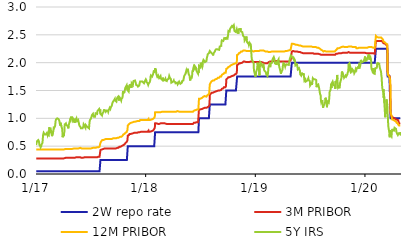
| Category | 2W repo rate | 3M PRIBOR | 12M PRIBOR | 5Y IRS |
|---|---|---|---|---|
| 2017-01-02 | 0.05 | 0.28 | 0.44 | 0.52 |
| 2017-01-03 | 0.05 | 0.28 | 0.44 | 0.52 |
| 2017-01-04 | 0.05 | 0.28 | 0.44 | 0.57 |
| 2017-01-05 | 0.05 | 0.28 | 0.44 | 0.59 |
| 2017-01-06 | 0.05 | 0.28 | 0.44 | 0.58 |
| 2017-01-09 | 0.05 | 0.28 | 0.44 | 0.61 |
| 2017-01-10 | 0.05 | 0.28 | 0.44 | 0.6 |
| 2017-01-11 | 0.05 | 0.28 | 0.44 | 0.59 |
| 2017-01-12 | 0.05 | 0.28 | 0.44 | 0.56 |
| 2017-01-13 | 0.05 | 0.28 | 0.44 | 0.52 |
| 2017-01-16 | 0.05 | 0.28 | 0.44 | 0.5 |
| 2017-01-17 | 0.05 | 0.28 | 0.44 | 0.48 |
| 2017-01-18 | 0.05 | 0.28 | 0.44 | 0.48 |
| 2017-01-19 | 0.05 | 0.28 | 0.44 | 0.5 |
| 2017-01-20 | 0.05 | 0.28 | 0.44 | 0.53 |
| 2017-01-23 | 0.05 | 0.28 | 0.44 | 0.56 |
| 2017-01-24 | 0.05 | 0.28 | 0.44 | 0.62 |
| 2017-01-25 | 0.05 | 0.28 | 0.44 | 0.7 |
| 2017-01-26 | 0.05 | 0.28 | 0.44 | 0.7 |
| 2017-01-27 | 0.05 | 0.28 | 0.44 | 0.74 |
| 2017-01-30 | 0.05 | 0.28 | 0.44 | 0.71 |
| 2017-01-31 | 0.05 | 0.28 | 0.44 | 0.71 |
| 2017-02-01 | 0.05 | 0.28 | 0.44 | 0.7 |
| 2017-02-02 | 0.05 | 0.28 | 0.44 | 0.72 |
| 2017-02-03 | 0.05 | 0.28 | 0.44 | 0.71 |
| 2017-02-06 | 0.05 | 0.28 | 0.44 | 0.71 |
| 2017-02-07 | 0.05 | 0.28 | 0.44 | 0.74 |
| 2017-02-08 | 0.05 | 0.28 | 0.44 | 0.75 |
| 2017-02-09 | 0.05 | 0.28 | 0.44 | 0.7 |
| 2017-02-10 | 0.05 | 0.28 | 0.44 | 0.72 |
| 2017-02-13 | 0.05 | 0.28 | 0.44 | 0.7 |
| 2017-02-14 | 0.05 | 0.28 | 0.44 | 0.77 |
| 2017-02-15 | 0.05 | 0.28 | 0.44 | 0.84 |
| 2017-02-16 | 0.05 | 0.28 | 0.44 | 0.83 |
| 2017-02-17 | 0.05 | 0.28 | 0.44 | 0.76 |
| 2017-02-20 | 0.05 | 0.28 | 0.44 | 0.79 |
| 2017-02-21 | 0.05 | 0.28 | 0.44 | 0.8 |
| 2017-02-22 | 0.05 | 0.28 | 0.44 | 0.78 |
| 2017-02-23 | 0.05 | 0.28 | 0.44 | 0.7 |
| 2017-02-24 | 0.05 | 0.28 | 0.44 | 0.68 |
| 2017-02-27 | 0.05 | 0.28 | 0.44 | 0.68 |
| 2017-02-28 | 0.05 | 0.28 | 0.44 | 0.77 |
| 2017-03-01 | 0.05 | 0.28 | 0.44 | 0.77 |
| 2017-03-02 | 0.05 | 0.28 | 0.44 | 0.85 |
| 2017-03-03 | 0.05 | 0.28 | 0.44 | 0.83 |
| 2017-03-06 | 0.05 | 0.28 | 0.44 | 0.86 |
| 2017-03-07 | 0.05 | 0.28 | 0.44 | 0.87 |
| 2017-03-08 | 0.05 | 0.28 | 0.44 | 0.96 |
| 2017-03-09 | 0.05 | 0.28 | 0.44 | 0.98 |
| 2017-03-10 | 0.05 | 0.28 | 0.44 | 0.99 |
| 2017-03-13 | 0.05 | 0.28 | 0.44 | 1 |
| 2017-03-14 | 0.05 | 0.28 | 0.44 | 1 |
| 2017-03-15 | 0.05 | 0.28 | 0.44 | 0.99 |
| 2017-03-16 | 0.05 | 0.28 | 0.44 | 0.99 |
| 2017-03-17 | 0.05 | 0.28 | 0.44 | 0.99 |
| 2017-03-20 | 0.05 | 0.28 | 0.44 | 0.96 |
| 2017-03-21 | 0.05 | 0.28 | 0.44 | 0.97 |
| 2017-03-22 | 0.05 | 0.28 | 0.44 | 0.9 |
| 2017-03-23 | 0.05 | 0.28 | 0.44 | 0.87 |
| 2017-03-24 | 0.05 | 0.28 | 0.44 | 0.92 |
| 2017-03-27 | 0.05 | 0.28 | 0.44 | 0.86 |
| 2017-03-28 | 0.05 | 0.28 | 0.44 | 0.84 |
| 2017-03-29 | 0.05 | 0.28 | 0.44 | 0.84 |
| 2017-03-30 | 0.05 | 0.28 | 0.44 | 0.8 |
| 2017-03-31 | 0.05 | 0.28 | 0.44 | 0.66 |
| 2017-04-03 | 0.05 | 0.28 | 0.44 | 0.71 |
| 2017-04-04 | 0.05 | 0.28 | 0.44 | 0.68 |
| 2017-04-05 | 0.05 | 0.28 | 0.44 | 0.73 |
| 2017-04-06 | 0.05 | 0.28 | 0.44 | 0.76 |
| 2017-04-07 | 0.05 | 0.29 | 0.44 | 0.89 |
| 2017-04-10 | 0.05 | 0.29 | 0.45 | 0.89 |
| 2017-04-11 | 0.05 | 0.29 | 0.45 | 0.91 |
| 2017-04-12 | 0.05 | 0.29 | 0.45 | 0.89 |
| 2017-04-13 | 0.05 | 0.29 | 0.45 | 0.88 |
| 2017-04-18 | 0.05 | 0.29 | 0.45 | 0.85 |
| 2017-04-19 | 0.05 | 0.29 | 0.45 | 0.82 |
| 2017-04-20 | 0.05 | 0.29 | 0.45 | 0.87 |
| 2017-04-21 | 0.05 | 0.29 | 0.45 | 0.88 |
| 2017-04-24 | 0.05 | 0.29 | 0.45 | 0.95 |
| 2017-04-25 | 0.05 | 0.29 | 0.45 | 0.93 |
| 2017-04-26 | 0.05 | 0.29 | 0.45 | 0.94 |
| 2017-04-27 | 0.05 | 0.29 | 0.45 | 0.99 |
| 2017-04-28 | 0.05 | 0.29 | 0.45 | 1.02 |
| 2017-05-02 | 0.05 | 0.29 | 0.45 | 1.02 |
| 2017-05-03 | 0.05 | 0.29 | 0.45 | 0.98 |
| 2017-05-04 | 0.05 | 0.29 | 0.45 | 1.01 |
| 2017-05-05 | 0.05 | 0.29 | 0.45 | 0.95 |
| 2017-05-09 | 0.05 | 0.29 | 0.46 | 0.97 |
| 2017-05-10 | 0.05 | 0.29 | 0.46 | 0.92 |
| 2017-05-11 | 0.05 | 0.3 | 0.46 | 0.94 |
| 2017-05-12 | 0.05 | 0.3 | 0.46 | 0.96 |
| 2017-05-15 | 0.05 | 0.3 | 0.46 | 0.96 |
| 2017-05-16 | 0.05 | 0.3 | 0.46 | 1 |
| 2017-05-17 | 0.05 | 0.3 | 0.46 | 0.97 |
| 2017-05-18 | 0.05 | 0.3 | 0.46 | 0.95 |
| 2017-05-19 | 0.05 | 0.3 | 0.46 | 0.96 |
| 2017-05-22 | 0.05 | 0.3 | 0.46 | 0.97 |
| 2017-05-23 | 0.05 | 0.3 | 0.46 | 0.94 |
| 2017-05-24 | 0.05 | 0.3 | 0.47 | 0.92 |
| 2017-05-25 | 0.05 | 0.3 | 0.47 | 0.89 |
| 2017-05-26 | 0.05 | 0.3 | 0.47 | 0.87 |
| 2017-05-29 | 0.05 | 0.3 | 0.47 | 0.87 |
| 2017-05-30 | 0.05 | 0.3 | 0.46 | 0.84 |
| 2017-05-31 | 0.05 | 0.3 | 0.46 | 0.82 |
| 2017-06-01 | 0.05 | 0.3 | 0.46 | 0.81 |
| 2017-06-02 | 0.05 | 0.29 | 0.46 | 0.81 |
| 2017-06-05 | 0.05 | 0.29 | 0.46 | 0.82 |
| 2017-06-06 | 0.05 | 0.29 | 0.46 | 0.82 |
| 2017-06-07 | 0.05 | 0.29 | 0.46 | 0.81 |
| 2017-06-08 | 0.05 | 0.29 | 0.46 | 0.85 |
| 2017-06-09 | 0.05 | 0.3 | 0.46 | 0.89 |
| 2017-06-12 | 0.05 | 0.3 | 0.46 | 0.86 |
| 2017-06-13 | 0.05 | 0.3 | 0.46 | 0.87 |
| 2017-06-14 | 0.05 | 0.3 | 0.46 | 0.87 |
| 2017-06-15 | 0.05 | 0.3 | 0.46 | 0.83 |
| 2017-06-16 | 0.05 | 0.3 | 0.46 | 0.88 |
| 2017-06-19 | 0.05 | 0.3 | 0.46 | 0.86 |
| 2017-06-20 | 0.05 | 0.3 | 0.46 | 0.86 |
| 2017-06-21 | 0.05 | 0.3 | 0.46 | 0.86 |
| 2017-06-22 | 0.05 | 0.3 | 0.46 | 0.86 |
| 2017-06-23 | 0.05 | 0.3 | 0.46 | 0.84 |
| 2017-06-26 | 0.05 | 0.3 | 0.46 | 0.83 |
| 2017-06-27 | 0.05 | 0.3 | 0.46 | 0.82 |
| 2017-06-28 | 0.05 | 0.3 | 0.46 | 0.89 |
| 2017-06-29 | 0.05 | 0.29 | 0.46 | 0.94 |
| 2017-06-30 | 0.05 | 0.3 | 0.46 | 0.97 |
| 2017-07-03 | 0.05 | 0.3 | 0.46 | 0.99 |
| 2017-07-04 | 0.05 | 0.3 | 0.46 | 0.98 |
| 2017-07-07 | 0.05 | 0.3 | 0.47 | 1.06 |
| 2017-07-10 | 0.05 | 0.3 | 0.47 | 1.08 |
| 2017-07-11 | 0.05 | 0.3 | 0.47 | 1.05 |
| 2017-07-12 | 0.05 | 0.3 | 0.47 | 1.05 |
| 2017-07-13 | 0.05 | 0.3 | 0.47 | 1.03 |
| 2017-07-14 | 0.05 | 0.3 | 0.47 | 1.03 |
| 2017-07-17 | 0.05 | 0.3 | 0.47 | 1.03 |
| 2017-07-18 | 0.05 | 0.3 | 0.47 | 1.03 |
| 2017-07-19 | 0.05 | 0.3 | 0.47 | 1.09 |
| 2017-07-20 | 0.05 | 0.3 | 0.48 | 1.1 |
| 2017-07-21 | 0.05 | 0.3 | 0.48 | 1.08 |
| 2017-07-24 | 0.05 | 0.3 | 0.48 | 1.08 |
| 2017-07-25 | 0.05 | 0.3 | 0.48 | 1.13 |
| 2017-07-26 | 0.05 | 0.3 | 0.48 | 1.14 |
| 2017-07-27 | 0.05 | 0.3 | 0.48 | 1.14 |
| 2017-07-28 | 0.05 | 0.31 | 0.48 | 1.15 |
| 2017-07-31 | 0.05 | 0.31 | 0.49 | 1.17 |
| 2017-08-01 | 0.05 | 0.31 | 0.49 | 1.18 |
| 2017-08-02 | 0.05 | 0.31 | 0.49 | 1.14 |
| 2017-08-03 | 0.05 | 0.31 | 0.49 | 1.16 |
| 2017-08-04 | 0.25 | 0.43 | 0.56 | 1.08 |
| 2017-08-07 | 0.25 | 0.44 | 0.59 | 1.07 |
| 2017-08-08 | 0.25 | 0.44 | 0.6 | 1.06 |
| 2017-08-09 | 0.25 | 0.45 | 0.6 | 1.09 |
| 2017-08-10 | 0.25 | 0.45 | 0.61 | 1.07 |
| 2017-08-11 | 0.25 | 0.45 | 0.61 | 1.09 |
| 2017-08-14 | 0.25 | 0.45 | 0.61 | 1.11 |
| 2017-08-15 | 0.25 | 0.45 | 0.61 | 1.11 |
| 2017-08-16 | 0.25 | 0.45 | 0.62 | 1.16 |
| 2017-08-17 | 0.25 | 0.46 | 0.62 | 1.14 |
| 2017-08-18 | 0.25 | 0.46 | 0.62 | 1.14 |
| 2017-08-21 | 0.25 | 0.46 | 0.62 | 1.14 |
| 2017-08-22 | 0.25 | 0.46 | 0.63 | 1.12 |
| 2017-08-23 | 0.25 | 0.46 | 0.63 | 1.13 |
| 2017-08-24 | 0.25 | 0.46 | 0.63 | 1.13 |
| 2017-08-25 | 0.25 | 0.46 | 0.63 | 1.14 |
| 2017-08-28 | 0.25 | 0.46 | 0.63 | 1.14 |
| 2017-08-29 | 0.25 | 0.46 | 0.63 | 1.14 |
| 2017-08-30 | 0.25 | 0.46 | 0.63 | 1.12 |
| 2017-08-31 | 0.25 | 0.46 | 0.63 | 1.14 |
| 2017-09-01 | 0.25 | 0.46 | 0.63 | 1.15 |
| 2017-09-04 | 0.25 | 0.46 | 0.63 | 1.19 |
| 2017-09-05 | 0.25 | 0.46 | 0.63 | 1.19 |
| 2017-09-06 | 0.25 | 0.46 | 0.63 | 1.17 |
| 2017-09-07 | 0.25 | 0.46 | 0.63 | 1.19 |
| 2017-09-08 | 0.25 | 0.46 | 0.63 | 1.2 |
| 2017-09-11 | 0.25 | 0.46 | 0.63 | 1.23 |
| 2017-09-12 | 0.25 | 0.46 | 0.64 | 1.24 |
| 2017-09-13 | 0.25 | 0.46 | 0.64 | 1.28 |
| 2017-09-14 | 0.25 | 0.46 | 0.64 | 1.28 |
| 2017-09-15 | 0.25 | 0.46 | 0.64 | 1.3 |
| 2017-09-18 | 0.25 | 0.46 | 0.64 | 1.3 |
| 2017-09-19 | 0.25 | 0.46 | 0.64 | 1.33 |
| 2017-09-20 | 0.25 | 0.46 | 0.64 | 1.32 |
| 2017-09-21 | 0.25 | 0.46 | 0.64 | 1.35 |
| 2017-09-22 | 0.25 | 0.46 | 0.64 | 1.32 |
| 2017-09-25 | 0.25 | 0.46 | 0.64 | 1.31 |
| 2017-09-26 | 0.25 | 0.46 | 0.64 | 1.3 |
| 2017-09-27 | 0.25 | 0.47 | 0.64 | 1.33 |
| 2017-09-29 | 0.25 | 0.47 | 0.65 | 1.37 |
| 2017-10-02 | 0.25 | 0.47 | 0.65 | 1.39 |
| 2017-10-03 | 0.25 | 0.47 | 0.65 | 1.39 |
| 2017-10-04 | 0.25 | 0.47 | 0.65 | 1.36 |
| 2017-10-05 | 0.25 | 0.48 | 0.66 | 1.32 |
| 2017-10-06 | 0.25 | 0.49 | 0.66 | 1.38 |
| 2017-10-09 | 0.25 | 0.49 | 0.67 | 1.36 |
| 2017-10-10 | 0.25 | 0.49 | 0.67 | 1.35 |
| 2017-10-11 | 0.25 | 0.49 | 0.66 | 1.37 |
| 2017-10-12 | 0.25 | 0.49 | 0.66 | 1.32 |
| 2017-10-13 | 0.25 | 0.5 | 0.67 | 1.35 |
| 2017-10-16 | 0.25 | 0.51 | 0.68 | 1.37 |
| 2017-10-17 | 0.25 | 0.51 | 0.69 | 1.4 |
| 2017-10-18 | 0.25 | 0.52 | 0.7 | 1.49 |
| 2017-10-19 | 0.25 | 0.52 | 0.71 | 1.45 |
| 2017-10-20 | 0.25 | 0.52 | 0.71 | 1.46 |
| 2017-10-23 | 0.25 | 0.53 | 0.72 | 1.47 |
| 2017-10-24 | 0.25 | 0.54 | 0.72 | 1.47 |
| 2017-10-25 | 0.25 | 0.54 | 0.73 | 1.53 |
| 2017-10-26 | 0.25 | 0.55 | 0.74 | 1.55 |
| 2017-10-27 | 0.25 | 0.56 | 0.74 | 1.56 |
| 2017-10-30 | 0.25 | 0.57 | 0.75 | 1.59 |
| 2017-10-31 | 0.25 | 0.58 | 0.77 | 1.52 |
| 2017-11-01 | 0.25 | 0.59 | 0.77 | 1.53 |
| 2017-11-02 | 0.25 | 0.61 | 0.79 | 1.59 |
| 2017-11-03 | 0.5 | 0.69 | 0.87 | 1.5 |
| 2017-11-06 | 0.5 | 0.7 | 0.89 | 1.48 |
| 2017-11-07 | 0.5 | 0.7 | 0.89 | 1.53 |
| 2017-11-08 | 0.5 | 0.71 | 0.89 | 1.52 |
| 2017-11-09 | 0.5 | 0.72 | 0.9 | 1.57 |
| 2017-11-10 | 0.5 | 0.72 | 0.91 | 1.61 |
| 2017-11-13 | 0.5 | 0.72 | 0.91 | 1.56 |
| 2017-11-14 | 0.5 | 0.72 | 0.92 | 1.59 |
| 2017-11-15 | 0.5 | 0.72 | 0.92 | 1.55 |
| 2017-11-16 | 0.5 | 0.72 | 0.93 | 1.63 |
| 2017-11-20 | 0.5 | 0.73 | 0.93 | 1.6 |
| 2017-11-21 | 0.5 | 0.73 | 0.94 | 1.65 |
| 2017-11-22 | 0.5 | 0.73 | 0.94 | 1.67 |
| 2017-11-23 | 0.5 | 0.73 | 0.94 | 1.68 |
| 2017-11-24 | 0.5 | 0.74 | 0.94 | 1.68 |
| 2017-11-27 | 0.5 | 0.74 | 0.94 | 1.68 |
| 2017-11-28 | 0.5 | 0.74 | 0.94 | 1.68 |
| 2017-11-29 | 0.5 | 0.74 | 0.95 | 1.65 |
| 2017-11-30 | 0.5 | 0.74 | 0.95 | 1.66 |
| 2017-12-01 | 0.5 | 0.74 | 0.94 | 1.6 |
| 2017-12-04 | 0.5 | 0.74 | 0.95 | 1.6 |
| 2017-12-05 | 0.5 | 0.74 | 0.95 | 1.59 |
| 2017-12-06 | 0.5 | 0.74 | 0.95 | 1.58 |
| 2017-12-07 | 0.5 | 0.74 | 0.95 | 1.57 |
| 2017-12-08 | 0.5 | 0.75 | 0.95 | 1.57 |
| 2017-12-11 | 0.5 | 0.75 | 0.95 | 1.59 |
| 2017-12-12 | 0.5 | 0.75 | 0.95 | 1.59 |
| 2017-12-13 | 0.5 | 0.75 | 0.96 | 1.64 |
| 2017-12-14 | 0.5 | 0.76 | 0.97 | 1.66 |
| 2017-12-15 | 0.5 | 0.76 | 0.97 | 1.66 |
| 2017-12-18 | 0.5 | 0.76 | 0.97 | 1.66 |
| 2017-12-19 | 0.5 | 0.76 | 0.97 | 1.65 |
| 2017-12-20 | 0.5 | 0.76 | 0.97 | 1.66 |
| 2017-12-21 | 0.5 | 0.76 | 0.97 | 1.66 |
| 2017-12-22 | 0.5 | 0.76 | 0.97 | 1.66 |
| 2017-12-27 | 0.5 | 0.76 | 0.97 | 1.63 |
| 2017-12-28 | 0.5 | 0.76 | 0.97 | 1.64 |
| 2017-12-29 | 0.5 | 0.76 | 0.97 | 1.64 |
| 2018-01-02 | 0.5 | 0.76 | 0.97 | 1.7 |
| 2018-01-03 | 0.5 | 0.76 | 0.97 | 1.69 |
| 2018-01-04 | 0.5 | 0.76 | 0.97 | 1.68 |
| 2018-01-05 | 0.5 | 0.76 | 0.97 | 1.65 |
| 2018-01-08 | 0.5 | 0.76 | 0.97 | 1.63 |
| 2018-01-09 | 0.5 | 0.76 | 0.97 | 1.63 |
| 2018-01-10 | 0.5 | 0.76 | 0.97 | 1.6 |
| 2018-01-11 | 0.5 | 0.78 | 0.99 | 1.59 |
| 2018-01-12 | 0.5 | 0.76 | 0.97 | 1.63 |
| 2018-01-15 | 0.5 | 0.76 | 0.97 | 1.65 |
| 2018-01-16 | 0.5 | 0.76 | 0.97 | 1.66 |
| 2018-01-17 | 0.5 | 0.77 | 0.98 | 1.69 |
| 2018-01-18 | 0.5 | 0.77 | 0.98 | 1.75 |
| 2018-01-19 | 0.5 | 0.77 | 0.98 | 1.77 |
| 2018-01-22 | 0.5 | 0.77 | 0.98 | 1.77 |
| 2018-01-23 | 0.5 | 0.77 | 0.98 | 1.75 |
| 2018-01-24 | 0.5 | 0.77 | 0.98 | 1.75 |
| 2018-01-25 | 0.5 | 0.78 | 0.99 | 1.75 |
| 2018-01-26 | 0.5 | 0.78 | 0.99 | 1.79 |
| 2018-01-29 | 0.5 | 0.79 | 1 | 1.86 |
| 2018-01-30 | 0.5 | 0.81 | 1.01 | 1.84 |
| 2018-01-31 | 0.5 | 0.81 | 1.02 | 1.82 |
| 2018-02-01 | 0.5 | 0.83 | 1.03 | 1.86 |
| 2018-02-02 | 0.75 | 0.91 | 1.11 | 1.9 |
| 2018-02-05 | 0.75 | 0.91 | 1.11 | 1.86 |
| 2018-02-06 | 0.75 | 0.91 | 1.11 | 1.8 |
| 2018-02-07 | 0.75 | 0.91 | 1.11 | 1.79 |
| 2018-02-08 | 0.75 | 0.91 | 1.11 | 1.81 |
| 2018-02-09 | 0.75 | 0.9 | 1.11 | 1.75 |
| 2018-02-12 | 0.75 | 0.9 | 1.11 | 1.77 |
| 2018-02-13 | 0.75 | 0.9 | 1.11 | 1.75 |
| 2018-02-14 | 0.75 | 0.9 | 1.11 | 1.72 |
| 2018-02-15 | 0.75 | 0.9 | 1.11 | 1.76 |
| 2018-02-16 | 0.75 | 0.9 | 1.11 | 1.73 |
| 2018-02-19 | 0.75 | 0.91 | 1.11 | 1.72 |
| 2018-02-20 | 0.75 | 0.91 | 1.11 | 1.76 |
| 2018-02-21 | 0.75 | 0.91 | 1.11 | 1.73 |
| 2018-02-22 | 0.75 | 0.91 | 1.12 | 1.71 |
| 2018-02-23 | 0.75 | 0.91 | 1.12 | 1.71 |
| 2018-02-26 | 0.75 | 0.91 | 1.12 | 1.69 |
| 2018-02-27 | 0.75 | 0.91 | 1.12 | 1.71 |
| 2018-02-28 | 0.75 | 0.91 | 1.12 | 1.73 |
| 2018-03-01 | 0.75 | 0.91 | 1.12 | 1.7 |
| 2018-03-02 | 0.75 | 0.91 | 1.12 | 1.68 |
| 2018-03-05 | 0.75 | 0.91 | 1.12 | 1.67 |
| 2018-03-06 | 0.75 | 0.91 | 1.12 | 1.69 |
| 2018-03-07 | 0.75 | 0.91 | 1.12 | 1.69 |
| 2018-03-08 | 0.75 | 0.91 | 1.12 | 1.71 |
| 2018-03-09 | 0.75 | 0.9 | 1.12 | 1.68 |
| 2018-03-12 | 0.75 | 0.9 | 1.12 | 1.67 |
| 2018-03-13 | 0.75 | 0.9 | 1.12 | 1.67 |
| 2018-03-14 | 0.75 | 0.9 | 1.12 | 1.67 |
| 2018-03-15 | 0.75 | 0.9 | 1.12 | 1.7 |
| 2018-03-16 | 0.75 | 0.9 | 1.12 | 1.7 |
| 2018-03-19 | 0.75 | 0.9 | 1.12 | 1.71 |
| 2018-03-20 | 0.75 | 0.9 | 1.12 | 1.72 |
| 2018-03-21 | 0.75 | 0.9 | 1.12 | 1.76 |
| 2018-03-22 | 0.75 | 0.9 | 1.12 | 1.75 |
| 2018-03-23 | 0.75 | 0.9 | 1.12 | 1.73 |
| 2018-03-26 | 0.75 | 0.9 | 1.12 | 1.71 |
| 2018-03-27 | 0.75 | 0.9 | 1.12 | 1.69 |
| 2018-03-28 | 0.75 | 0.9 | 1.12 | 1.64 |
| 2018-03-29 | 0.75 | 0.9 | 1.12 | 1.65 |
| 2018-04-03 | 0.75 | 0.9 | 1.12 | 1.66 |
| 2018-04-04 | 0.75 | 0.9 | 1.12 | 1.66 |
| 2018-04-05 | 0.75 | 0.9 | 1.12 | 1.68 |
| 2018-04-06 | 0.75 | 0.9 | 1.12 | 1.66 |
| 2018-04-09 | 0.75 | 0.9 | 1.12 | 1.65 |
| 2018-04-10 | 0.75 | 0.9 | 1.12 | 1.65 |
| 2018-04-11 | 0.75 | 0.9 | 1.12 | 1.63 |
| 2018-04-12 | 0.75 | 0.9 | 1.12 | 1.62 |
| 2018-04-13 | 0.75 | 0.9 | 1.12 | 1.64 |
| 2018-04-16 | 0.75 | 0.9 | 1.12 | 1.64 |
| 2018-04-17 | 0.75 | 0.9 | 1.13 | 1.63 |
| 2018-04-18 | 0.75 | 0.9 | 1.12 | 1.61 |
| 2018-04-19 | 0.75 | 0.9 | 1.12 | 1.62 |
| 2018-04-20 | 0.75 | 0.9 | 1.12 | 1.63 |
| 2018-04-23 | 0.75 | 0.9 | 1.12 | 1.66 |
| 2018-04-24 | 0.75 | 0.9 | 1.12 | 1.65 |
| 2018-04-25 | 0.75 | 0.9 | 1.12 | 1.66 |
| 2018-04-26 | 0.75 | 0.9 | 1.12 | 1.66 |
| 2018-04-27 | 0.75 | 0.9 | 1.12 | 1.62 |
| 2018-04-30 | 0.75 | 0.9 | 1.12 | 1.62 |
| 2018-05-02 | 0.75 | 0.9 | 1.12 | 1.64 |
| 2018-05-03 | 0.75 | 0.9 | 1.12 | 1.67 |
| 2018-05-04 | 0.75 | 0.9 | 1.12 | 1.68 |
| 2018-05-07 | 0.75 | 0.9 | 1.12 | 1.68 |
| 2018-05-09 | 0.75 | 0.9 | 1.12 | 1.74 |
| 2018-05-10 | 0.75 | 0.9 | 1.12 | 1.76 |
| 2018-05-11 | 0.75 | 0.9 | 1.12 | 1.76 |
| 2018-05-14 | 0.75 | 0.9 | 1.12 | 1.8 |
| 2018-05-15 | 0.75 | 0.9 | 1.12 | 1.82 |
| 2018-05-16 | 0.75 | 0.9 | 1.12 | 1.84 |
| 2018-05-17 | 0.75 | 0.9 | 1.12 | 1.86 |
| 2018-05-18 | 0.75 | 0.9 | 1.12 | 1.84 |
| 2018-05-21 | 0.75 | 0.9 | 1.12 | 1.87 |
| 2018-05-22 | 0.75 | 0.9 | 1.12 | 1.89 |
| 2018-05-23 | 0.75 | 0.9 | 1.12 | 1.85 |
| 2018-05-24 | 0.75 | 0.9 | 1.12 | 1.82 |
| 2018-05-25 | 0.75 | 0.9 | 1.12 | 1.79 |
| 2018-05-28 | 0.75 | 0.9 | 1.12 | 1.76 |
| 2018-05-29 | 0.75 | 0.9 | 1.12 | 1.7 |
| 2018-05-30 | 0.75 | 0.9 | 1.12 | 1.68 |
| 2018-05-31 | 0.75 | 0.9 | 1.12 | 1.73 |
| 2018-06-01 | 0.75 | 0.9 | 1.12 | 1.72 |
| 2018-06-04 | 0.75 | 0.9 | 1.12 | 1.73 |
| 2018-06-05 | 0.75 | 0.9 | 1.12 | 1.76 |
| 2018-06-06 | 0.75 | 0.9 | 1.12 | 1.83 |
| 2018-06-07 | 0.75 | 0.9 | 1.12 | 1.86 |
| 2018-06-08 | 0.75 | 0.9 | 1.12 | 1.84 |
| 2018-06-11 | 0.75 | 0.92 | 1.13 | 1.93 |
| 2018-06-12 | 0.75 | 0.92 | 1.14 | 1.93 |
| 2018-06-13 | 0.75 | 0.92 | 1.14 | 1.91 |
| 2018-06-14 | 0.75 | 0.93 | 1.14 | 1.94 |
| 2018-06-15 | 0.75 | 0.92 | 1.14 | 1.94 |
| 2018-06-18 | 0.75 | 0.93 | 1.15 | 1.91 |
| 2018-06-19 | 0.75 | 0.93 | 1.15 | 1.87 |
| 2018-06-20 | 0.75 | 0.93 | 1.15 | 1.85 |
| 2018-06-21 | 0.75 | 0.93 | 1.15 | 1.85 |
| 2018-06-22 | 0.75 | 0.93 | 1.16 | 1.85 |
| 2018-06-25 | 0.75 | 0.93 | 1.16 | 1.8 |
| 2018-06-26 | 0.75 | 0.93 | 1.16 | 1.84 |
| 2018-06-27 | 0.75 | 0.93 | 1.16 | 1.82 |
| 2018-06-28 | 1 | 1.16 | 1.35 | 1.94 |
| 2018-06-29 | 1 | 1.16 | 1.35 | 1.94 |
| 2018-07-02 | 1 | 1.16 | 1.35 | 1.92 |
| 2018-07-03 | 1 | 1.16 | 1.35 | 1.97 |
| 2018-07-04 | 1 | 1.17 | 1.36 | 2 |
| 2018-07-09 | 1 | 1.17 | 1.37 | 1.92 |
| 2018-07-10 | 1 | 1.17 | 1.37 | 1.94 |
| 2018-07-11 | 1 | 1.18 | 1.38 | 2.02 |
| 2018-07-12 | 1 | 1.18 | 1.38 | 2.02 |
| 2018-07-13 | 1 | 1.18 | 1.39 | 2.05 |
| 2018-07-16 | 1 | 1.18 | 1.39 | 2.03 |
| 2018-07-17 | 1 | 1.19 | 1.4 | 2.03 |
| 2018-07-18 | 1 | 1.18 | 1.39 | 2.01 |
| 2018-07-19 | 1 | 1.19 | 1.39 | 2.02 |
| 2018-07-20 | 1 | 1.18 | 1.39 | 2.01 |
| 2018-07-23 | 1 | 1.19 | 1.39 | 2.03 |
| 2018-07-24 | 1 | 1.19 | 1.4 | 2.08 |
| 2018-07-25 | 1 | 1.2 | 1.41 | 2.09 |
| 2018-07-26 | 1 | 1.2 | 1.41 | 2.12 |
| 2018-07-27 | 1 | 1.2 | 1.41 | 2.15 |
| 2018-07-30 | 1 | 1.21 | 1.43 | 2.15 |
| 2018-07-31 | 1 | 1.22 | 1.43 | 2.17 |
| 2018-08-01 | 1 | 1.23 | 1.45 | 2.18 |
| 2018-08-02 | 1 | 1.24 | 1.45 | 2.17 |
| 2018-08-03 | 1.25 | 1.42 | 1.61 | 2.21 |
| 2018-08-06 | 1.25 | 1.44 | 1.64 | 2.19 |
| 2018-08-07 | 1.25 | 1.45 | 1.65 | 2.19 |
| 2018-08-08 | 1.25 | 1.45 | 1.66 | 2.19 |
| 2018-08-09 | 1.25 | 1.46 | 1.67 | 2.17 |
| 2018-08-10 | 1.25 | 1.46 | 1.67 | 2.18 |
| 2018-08-13 | 1.25 | 1.46 | 1.68 | 2.15 |
| 2018-08-14 | 1.25 | 1.46 | 1.68 | 2.13 |
| 2018-08-15 | 1.25 | 1.46 | 1.68 | 2.16 |
| 2018-08-16 | 1.25 | 1.46 | 1.68 | 2.17 |
| 2018-08-17 | 1.25 | 1.47 | 1.68 | 2.18 |
| 2018-08-20 | 1.25 | 1.47 | 1.69 | 2.2 |
| 2018-08-21 | 1.25 | 1.48 | 1.7 | 2.22 |
| 2018-08-22 | 1.25 | 1.48 | 1.71 | 2.22 |
| 2018-08-23 | 1.25 | 1.48 | 1.71 | 2.23 |
| 2018-08-24 | 1.25 | 1.48 | 1.71 | 2.24 |
| 2018-08-27 | 1.25 | 1.49 | 1.71 | 2.24 |
| 2018-08-28 | 1.25 | 1.49 | 1.72 | 2.24 |
| 2018-08-29 | 1.25 | 1.49 | 1.72 | 2.24 |
| 2018-08-30 | 1.25 | 1.49 | 1.73 | 2.24 |
| 2018-08-31 | 1.25 | 1.5 | 1.73 | 2.23 |
| 2018-09-03 | 1.25 | 1.5 | 1.73 | 2.23 |
| 2018-09-04 | 1.25 | 1.5 | 1.74 | 2.25 |
| 2018-09-05 | 1.25 | 1.51 | 1.74 | 2.29 |
| 2018-09-06 | 1.25 | 1.51 | 1.75 | 2.3 |
| 2018-09-07 | 1.25 | 1.51 | 1.74 | 2.3 |
| 2018-09-10 | 1.25 | 1.51 | 1.75 | 2.3 |
| 2018-09-11 | 1.25 | 1.52 | 1.77 | 2.37 |
| 2018-09-12 | 1.25 | 1.53 | 1.78 | 2.4 |
| 2018-09-13 | 1.25 | 1.54 | 1.78 | 2.39 |
| 2018-09-14 | 1.25 | 1.54 | 1.79 | 2.39 |
| 2018-09-17 | 1.25 | 1.54 | 1.79 | 2.39 |
| 2018-09-18 | 1.25 | 1.55 | 1.8 | 2.39 |
| 2018-09-19 | 1.25 | 1.56 | 1.81 | 2.42 |
| 2018-09-20 | 1.25 | 1.56 | 1.81 | 2.44 |
| 2018-09-21 | 1.25 | 1.56 | 1.82 | 2.43 |
| 2018-09-24 | 1.25 | 1.56 | 1.82 | 2.43 |
| 2018-09-25 | 1.25 | 1.57 | 1.82 | 2.46 |
| 2018-09-26 | 1.25 | 1.58 | 1.83 | 2.46 |
| 2018-09-27 | 1.5 | 1.7 | 1.89 | 2.43 |
| 2018-10-01 | 1.5 | 1.72 | 1.9 | 2.43 |
| 2018-10-02 | 1.5 | 1.73 | 1.91 | 2.43 |
| 2018-10-03 | 1.5 | 1.73 | 1.92 | 2.5 |
| 2018-10-04 | 1.5 | 1.74 | 1.93 | 2.57 |
| 2018-10-05 | 1.5 | 1.74 | 1.93 | 2.56 |
| 2018-10-08 | 1.5 | 1.74 | 1.93 | 2.56 |
| 2018-10-09 | 1.5 | 1.75 | 1.93 | 2.6 |
| 2018-10-10 | 1.5 | 1.75 | 1.94 | 2.61 |
| 2018-10-11 | 1.5 | 1.75 | 1.95 | 2.61 |
| 2018-10-12 | 1.5 | 1.75 | 1.96 | 2.63 |
| 2018-10-15 | 1.5 | 1.76 | 1.96 | 2.64 |
| 2018-10-16 | 1.5 | 1.76 | 1.97 | 2.66 |
| 2018-10-17 | 1.5 | 1.76 | 1.97 | 2.65 |
| 2018-10-18 | 1.5 | 1.76 | 1.97 | 2.66 |
| 2018-10-19 | 1.5 | 1.77 | 1.97 | 2.64 |
| 2018-10-22 | 1.5 | 1.77 | 1.97 | 2.67 |
| 2018-10-23 | 1.5 | 1.77 | 1.98 | 2.64 |
| 2018-10-24 | 1.5 | 1.78 | 1.98 | 2.57 |
| 2018-10-25 | 1.5 | 1.78 | 1.97 | 2.56 |
| 2018-10-26 | 1.5 | 1.79 | 1.98 | 2.56 |
| 2018-10-29 | 1.5 | 1.8 | 1.99 | 2.55 |
| 2018-10-30 | 1.5 | 1.8 | 1.99 | 2.56 |
| 2018-10-31 | 1.5 | 1.81 | 2 | 2.58 |
| 2018-11-01 | 1.5 | 1.82 | 2.01 | 2.6 |
| 2018-11-02 | 1.75 | 1.96 | 2.14 | 2.58 |
| 2018-11-05 | 1.75 | 1.97 | 2.14 | 2.57 |
| 2018-11-06 | 1.75 | 1.97 | 2.15 | 2.52 |
| 2018-11-07 | 1.75 | 1.97 | 2.16 | 2.56 |
| 2018-11-08 | 1.75 | 1.98 | 2.17 | 2.6 |
| 2018-11-09 | 1.75 | 1.99 | 2.18 | 2.6 |
| 2018-11-12 | 1.75 | 1.99 | 2.18 | 2.6 |
| 2018-11-13 | 1.75 | 1.99 | 2.18 | 2.62 |
| 2018-11-14 | 1.75 | 1.99 | 2.19 | 2.58 |
| 2018-11-15 | 1.75 | 2 | 2.2 | 2.56 |
| 2018-11-16 | 1.75 | 2 | 2.2 | 2.56 |
| 2018-11-19 | 1.75 | 2 | 2.2 | 2.55 |
| 2018-11-20 | 1.75 | 2.01 | 2.21 | 2.53 |
| 2018-11-21 | 1.75 | 2.01 | 2.21 | 2.51 |
| 2018-11-22 | 1.75 | 2.01 | 2.21 | 2.48 |
| 2018-11-23 | 1.75 | 2.02 | 2.22 | 2.49 |
| 2018-11-26 | 1.75 | 2.02 | 2.22 | 2.46 |
| 2018-11-27 | 1.75 | 2.02 | 2.22 | 2.4 |
| 2018-11-28 | 1.75 | 2.02 | 2.22 | 2.4 |
| 2018-11-29 | 1.75 | 2.02 | 2.22 | 2.42 |
| 2018-11-30 | 1.75 | 2.02 | 2.22 | 2.41 |
| 2018-12-03 | 1.75 | 2.01 | 2.21 | 2.47 |
| 2018-12-04 | 1.75 | 2.01 | 2.21 | 2.4 |
| 2018-12-05 | 1.75 | 2.01 | 2.21 | 2.37 |
| 2018-12-06 | 1.75 | 2.01 | 2.21 | 2.37 |
| 2018-12-07 | 1.75 | 2.01 | 2.21 | 2.36 |
| 2018-12-10 | 1.75 | 2.01 | 2.21 | 2.34 |
| 2018-12-11 | 1.75 | 2.01 | 2.21 | 2.32 |
| 2018-12-12 | 1.75 | 2.01 | 2.21 | 2.34 |
| 2018-12-13 | 1.75 | 2.02 | 2.21 | 2.36 |
| 2018-12-14 | 1.75 | 2.02 | 2.21 | 2.35 |
| 2018-12-17 | 1.75 | 2.02 | 2.21 | 2.33 |
| 2018-12-18 | 1.75 | 2.02 | 2.21 | 2.3 |
| 2018-12-19 | 1.75 | 2.02 | 2.21 | 2.29 |
| 2018-12-20 | 1.75 | 2.02 | 2.21 | 2.11 |
| 2018-12-21 | 1.75 | 2.02 | 2.21 | 2.06 |
| 2018-12-27 | 1.75 | 2.01 | 2.2 | 1.99 |
| 2018-12-28 | 1.75 | 2.02 | 2.21 | 1.86 |
| 2018-12-31 | 1.75 | 2.01 | 2.21 | 1.85 |
| 2019-01-02 | 1.75 | 2.01 | 2.2 | 1.75 |
| 2019-01-03 | 1.75 | 2.01 | 2.2 | 1.74 |
| 2019-01-04 | 1.75 | 2.01 | 2.21 | 1.83 |
| 2019-01-07 | 1.75 | 2.01 | 2.21 | 1.88 |
| 2019-01-08 | 1.75 | 2.01 | 2.21 | 1.9 |
| 2019-01-09 | 1.75 | 2.01 | 2.21 | 2 |
| 2019-01-10 | 1.75 | 2.01 | 2.21 | 1.97 |
| 2019-01-11 | 1.75 | 2.01 | 2.21 | 1.94 |
| 2019-01-14 | 1.75 | 2.01 | 2.21 | 1.88 |
| 2019-01-15 | 1.75 | 2.01 | 2.21 | 1.77 |
| 2019-01-16 | 1.75 | 2.01 | 2.21 | 1.88 |
| 2019-01-17 | 1.75 | 2.01 | 2.21 | 1.94 |
| 2019-01-18 | 1.75 | 2.01 | 2.22 | 2.01 |
| 2019-01-21 | 1.75 | 2.01 | 2.22 | 1.99 |
| 2019-01-22 | 1.75 | 2.01 | 2.22 | 1.99 |
| 2019-01-23 | 1.75 | 2.01 | 2.22 | 1.96 |
| 2019-01-24 | 1.75 | 2 | 2.22 | 1.97 |
| 2019-01-25 | 1.75 | 2 | 2.22 | 1.93 |
| 2019-01-28 | 1.75 | 2 | 2.22 | 1.93 |
| 2019-01-29 | 1.75 | 1.99 | 2.22 | 1.96 |
| 2019-01-30 | 1.75 | 1.99 | 2.21 | 1.93 |
| 2019-01-31 | 1.75 | 1.99 | 2.21 | 1.86 |
| 2019-02-01 | 1.75 | 1.99 | 2.21 | 1.86 |
| 2019-02-04 | 1.75 | 1.99 | 2.2 | 1.84 |
| 2019-02-05 | 1.75 | 1.99 | 2.2 | 1.83 |
| 2019-02-06 | 1.75 | 1.99 | 2.2 | 1.82 |
| 2019-02-07 | 1.75 | 1.99 | 2.2 | 1.79 |
| 2019-02-08 | 1.75 | 1.99 | 2.2 | 1.78 |
| 2019-02-11 | 1.75 | 1.99 | 2.2 | 1.76 |
| 2019-02-12 | 1.75 | 1.99 | 2.2 | 1.78 |
| 2019-02-13 | 1.75 | 2 | 2.19 | 1.83 |
| 2019-02-14 | 1.75 | 2 | 2.19 | 1.9 |
| 2019-02-15 | 1.75 | 2.01 | 2.19 | 1.93 |
| 2019-02-18 | 1.75 | 2.02 | 2.19 | 1.97 |
| 2019-02-19 | 1.75 | 2.02 | 2.19 | 1.98 |
| 2019-02-20 | 1.75 | 2.02 | 2.19 | 1.92 |
| 2019-02-21 | 1.75 | 2.02 | 2.19 | 1.95 |
| 2019-02-22 | 1.75 | 2.02 | 2.19 | 1.98 |
| 2019-02-25 | 1.75 | 2.02 | 2.2 | 1.99 |
| 2019-02-26 | 1.75 | 2.02 | 2.2 | 2 |
| 2019-02-27 | 1.75 | 2.02 | 2.2 | 2.02 |
| 2019-02-28 | 1.75 | 2.02 | 2.2 | 2.06 |
| 2019-03-01 | 1.75 | 2.03 | 2.2 | 2.07 |
| 2019-03-04 | 1.75 | 2.03 | 2.2 | 2.1 |
| 2019-03-05 | 1.75 | 2.03 | 2.2 | 2.1 |
| 2019-03-06 | 1.75 | 2.03 | 2.2 | 2.07 |
| 2019-03-07 | 1.75 | 2.03 | 2.21 | 2.06 |
| 2019-03-08 | 1.75 | 2.03 | 2.2 | 1.99 |
| 2019-03-11 | 1.75 | 2.03 | 2.2 | 1.99 |
| 2019-03-12 | 1.75 | 2.03 | 2.2 | 1.99 |
| 2019-03-13 | 1.75 | 2.03 | 2.2 | 1.96 |
| 2019-03-14 | 1.75 | 2.03 | 2.2 | 1.98 |
| 2019-03-15 | 1.75 | 2.03 | 2.2 | 2.02 |
| 2019-03-18 | 1.75 | 2.03 | 2.2 | 2.04 |
| 2019-03-19 | 1.75 | 2.03 | 2.2 | 2.05 |
| 2019-03-20 | 1.75 | 2.03 | 2.2 | 2.06 |
| 2019-03-21 | 1.75 | 2.03 | 2.2 | 1.98 |
| 2019-03-22 | 1.75 | 2.03 | 2.2 | 1.93 |
| 2019-03-25 | 1.75 | 2.02 | 2.2 | 1.87 |
| 2019-03-26 | 1.75 | 2.02 | 2.2 | 1.87 |
| 2019-03-27 | 1.75 | 2.02 | 2.2 | 1.86 |
| 2019-03-28 | 1.75 | 2.02 | 2.2 | 1.8 |
| 2019-03-29 | 1.75 | 2.02 | 2.2 | 1.83 |
| 2019-04-01 | 1.75 | 2.02 | 2.2 | 1.84 |
| 2019-04-02 | 1.75 | 2.02 | 2.2 | 1.87 |
| 2019-04-03 | 1.75 | 2.02 | 2.2 | 1.93 |
| 2019-04-04 | 1.75 | 2.02 | 2.2 | 1.94 |
| 2019-04-05 | 1.75 | 2.02 | 2.2 | 1.99 |
| 2019-04-08 | 1.75 | 2.02 | 2.2 | 1.98 |
| 2019-04-09 | 1.75 | 2.02 | 2.2 | 1.97 |
| 2019-04-10 | 1.75 | 2.02 | 2.2 | 1.97 |
| 2019-04-11 | 1.75 | 2.02 | 2.2 | 1.93 |
| 2019-04-12 | 1.75 | 2.02 | 2.21 | 1.95 |
| 2019-04-15 | 1.75 | 2.02 | 2.21 | 1.97 |
| 2019-04-16 | 1.75 | 2.02 | 2.21 | 1.96 |
| 2019-04-17 | 1.75 | 2.02 | 2.21 | 1.98 |
| 2019-04-18 | 1.75 | 2.02 | 2.21 | 1.98 |
| 2019-04-23 | 1.75 | 2.02 | 2.22 | 1.96 |
| 2019-04-24 | 1.75 | 2.02 | 2.22 | 1.99 |
| 2019-04-25 | 1.75 | 2.02 | 2.22 | 2 |
| 2019-04-26 | 1.75 | 2.03 | 2.23 | 2.06 |
| 2019-04-29 | 1.75 | 2.04 | 2.23 | 2.06 |
| 2019-04-30 | 1.75 | 2.05 | 2.23 | 2.13 |
| 2019-05-02 | 1.75 | 2.05 | 2.23 | 2.13 |
| 2019-05-03 | 2 | 2.2 | 2.34 | 2.12 |
| 2019-05-06 | 2 | 2.21 | 2.34 | 2.09 |
| 2019-05-07 | 2 | 2.21 | 2.34 | 2.08 |
| 2019-05-09 | 2 | 2.21 | 2.34 | 2.06 |
| 2019-05-10 | 2 | 2.2 | 2.34 | 2.08 |
| 2019-05-13 | 2 | 2.2 | 2.33 | 2.05 |
| 2019-05-14 | 2 | 2.2 | 2.33 | 2.02 |
| 2019-05-15 | 2 | 2.2 | 2.32 | 1.95 |
| 2019-05-16 | 2 | 2.2 | 2.32 | 1.95 |
| 2019-05-17 | 2 | 2.2 | 2.32 | 1.96 |
| 2019-05-20 | 2 | 2.2 | 2.32 | 1.97 |
| 2019-05-21 | 2 | 2.2 | 2.32 | 1.96 |
| 2019-05-22 | 2 | 2.2 | 2.32 | 1.92 |
| 2019-05-23 | 2 | 2.19 | 2.31 | 1.88 |
| 2019-05-24 | 2 | 2.19 | 2.31 | 1.88 |
| 2019-05-27 | 2 | 2.19 | 2.31 | 1.9 |
| 2019-05-28 | 2 | 2.19 | 2.31 | 1.88 |
| 2019-05-29 | 2 | 2.19 | 2.31 | 1.87 |
| 2019-05-30 | 2 | 2.19 | 2.31 | 1.86 |
| 2019-05-31 | 2 | 2.19 | 2.31 | 1.79 |
| 2019-06-03 | 2 | 2.19 | 2.31 | 1.77 |
| 2019-06-04 | 2 | 2.18 | 2.3 | 1.78 |
| 2019-06-05 | 2 | 2.18 | 2.3 | 1.82 |
| 2019-06-06 | 2 | 2.18 | 2.3 | 1.79 |
| 2019-06-07 | 2 | 2.18 | 2.3 | 1.8 |
| 2019-06-10 | 2 | 2.17 | 2.29 | 1.79 |
| 2019-06-11 | 2 | 2.17 | 2.29 | 1.81 |
| 2019-06-12 | 2 | 2.17 | 2.29 | 1.77 |
| 2019-06-13 | 2 | 2.17 | 2.29 | 1.73 |
| 2019-06-14 | 2 | 2.17 | 2.29 | 1.68 |
| 2019-06-17 | 2 | 2.17 | 2.29 | 1.7 |
| 2019-06-18 | 2 | 2.17 | 2.29 | 1.66 |
| 2019-06-19 | 2 | 2.17 | 2.29 | 1.66 |
| 2019-06-20 | 2 | 2.17 | 2.29 | 1.65 |
| 2019-06-21 | 2 | 2.17 | 2.29 | 1.67 |
| 2019-06-24 | 2 | 2.17 | 2.29 | 1.68 |
| 2019-06-25 | 2 | 2.17 | 2.29 | 1.68 |
| 2019-06-26 | 2 | 2.17 | 2.29 | 1.69 |
| 2019-06-27 | 2 | 2.17 | 2.29 | 1.72 |
| 2019-06-28 | 2 | 2.17 | 2.29 | 1.69 |
| 2019-07-01 | 2 | 2.17 | 2.29 | 1.68 |
| 2019-07-02 | 2 | 2.17 | 2.29 | 1.67 |
| 2019-07-03 | 2 | 2.17 | 2.29 | 1.59 |
| 2019-07-04 | 2 | 2.17 | 2.29 | 1.59 |
| 2019-07-08 | 2 | 2.17 | 2.29 | 1.63 |
| 2019-07-09 | 2 | 2.17 | 2.28 | 1.6 |
| 2019-07-10 | 2 | 2.17 | 2.28 | 1.63 |
| 2019-07-11 | 2 | 2.17 | 2.28 | 1.62 |
| 2019-07-12 | 2 | 2.17 | 2.28 | 1.72 |
| 2019-07-15 | 2 | 2.16 | 2.28 | 1.7 |
| 2019-07-16 | 2 | 2.16 | 2.28 | 1.7 |
| 2019-07-17 | 2 | 2.16 | 2.28 | 1.7 |
| 2019-07-18 | 2 | 2.16 | 2.28 | 1.7 |
| 2019-07-19 | 2 | 2.16 | 2.28 | 1.7 |
| 2019-07-22 | 2 | 2.16 | 2.28 | 1.7 |
| 2019-07-23 | 2 | 2.16 | 2.28 | 1.69 |
| 2019-07-24 | 2 | 2.16 | 2.28 | 1.59 |
| 2019-07-25 | 2 | 2.16 | 2.28 | 1.56 |
| 2019-07-26 | 2 | 2.16 | 2.27 | 1.6 |
| 2019-07-29 | 2 | 2.16 | 2.27 | 1.6 |
| 2019-07-30 | 2 | 2.16 | 2.27 | 1.61 |
| 2019-07-31 | 2 | 2.16 | 2.27 | 1.62 |
| 2019-08-01 | 2 | 2.16 | 2.27 | 1.62 |
| 2019-08-02 | 2 | 2.16 | 2.26 | 1.54 |
| 2019-08-05 | 2 | 2.15 | 2.25 | 1.44 |
| 2019-08-06 | 2 | 2.15 | 2.25 | 1.44 |
| 2019-08-07 | 2 | 2.15 | 2.24 | 1.41 |
| 2019-08-08 | 2 | 2.14 | 2.24 | 1.32 |
| 2019-08-09 | 2 | 2.14 | 2.23 | 1.29 |
| 2019-08-12 | 2 | 2.14 | 2.23 | 1.33 |
| 2019-08-13 | 2 | 2.14 | 2.22 | 1.27 |
| 2019-08-14 | 2 | 2.14 | 2.21 | 1.23 |
| 2019-08-15 | 2 | 2.14 | 2.21 | 1.19 |
| 2019-08-16 | 2 | 2.14 | 2.2 | 1.21 |
| 2019-08-19 | 2 | 2.14 | 2.21 | 1.25 |
| 2019-08-20 | 2 | 2.14 | 2.21 | 1.25 |
| 2019-08-21 | 2 | 2.14 | 2.21 | 1.27 |
| 2019-08-22 | 2 | 2.14 | 2.2 | 1.3 |
| 2019-08-23 | 2 | 2.14 | 2.2 | 1.37 |
| 2019-08-26 | 2 | 2.14 | 2.2 | 1.32 |
| 2019-08-27 | 2 | 2.14 | 2.2 | 1.27 |
| 2019-08-28 | 2 | 2.14 | 2.2 | 1.2 |
| 2019-08-29 | 2 | 2.14 | 2.2 | 1.25 |
| 2019-08-30 | 2 | 2.14 | 2.2 | 1.3 |
| 2019-09-02 | 2 | 2.14 | 2.2 | 1.3 |
| 2019-09-03 | 2 | 2.14 | 2.2 | 1.28 |
| 2019-09-04 | 2 | 2.14 | 2.2 | 1.32 |
| 2019-09-05 | 2 | 2.14 | 2.2 | 1.39 |
| 2019-09-06 | 2 | 2.14 | 2.2 | 1.48 |
| 2019-09-09 | 2 | 2.14 | 2.2 | 1.51 |
| 2019-09-10 | 2 | 2.14 | 2.2 | 1.56 |
| 2019-09-11 | 2 | 2.14 | 2.2 | 1.62 |
| 2019-09-12 | 2 | 2.14 | 2.2 | 1.55 |
| 2019-09-13 | 2 | 2.14 | 2.2 | 1.63 |
| 2019-09-16 | 2 | 2.14 | 2.2 | 1.66 |
| 2019-09-17 | 2 | 2.14 | 2.2 | 1.67 |
| 2019-09-18 | 2 | 2.14 | 2.2 | 1.62 |
| 2019-09-19 | 2 | 2.14 | 2.2 | 1.6 |
| 2019-09-20 | 2 | 2.14 | 2.2 | 1.61 |
| 2019-09-23 | 2 | 2.14 | 2.2 | 1.58 |
| 2019-09-24 | 2 | 2.14 | 2.2 | 1.56 |
| 2019-09-25 | 2 | 2.14 | 2.2 | 1.53 |
| 2019-09-26 | 2 | 2.15 | 2.22 | 1.67 |
| 2019-09-27 | 2 | 2.16 | 2.23 | 1.65 |
| 2019-09-30 | 2 | 2.16 | 2.24 | 1.7 |
| 2019-10-01 | 2 | 2.16 | 2.25 | 1.78 |
| 2019-10-02 | 2 | 2.16 | 2.26 | 1.71 |
| 2019-10-03 | 2 | 2.17 | 2.26 | 1.59 |
| 2019-10-04 | 2 | 2.17 | 2.25 | 1.55 |
| 2019-10-07 | 2 | 2.17 | 2.26 | 1.57 |
| 2019-10-08 | 2 | 2.17 | 2.27 | 1.54 |
| 2019-10-09 | 2 | 2.17 | 2.27 | 1.55 |
| 2019-10-10 | 2 | 2.17 | 2.27 | 1.54 |
| 2019-10-11 | 2 | 2.17 | 2.27 | 1.64 |
| 2019-10-14 | 2 | 2.17 | 2.28 | 1.7 |
| 2019-10-15 | 2 | 2.17 | 2.28 | 1.72 |
| 2019-10-16 | 2 | 2.18 | 2.29 | 1.79 |
| 2019-10-17 | 2 | 2.18 | 2.29 | 1.84 |
| 2019-10-18 | 2 | 2.18 | 2.29 | 1.85 |
| 2019-10-21 | 2 | 2.18 | 2.29 | 1.78 |
| 2019-10-22 | 2 | 2.18 | 2.29 | 1.74 |
| 2019-10-23 | 2 | 2.18 | 2.29 | 1.76 |
| 2019-10-24 | 2 | 2.18 | 2.28 | 1.73 |
| 2019-10-25 | 2 | 2.18 | 2.28 | 1.74 |
| 2019-10-29 | 2 | 2.18 | 2.28 | 1.77 |
| 2019-10-30 | 2 | 2.18 | 2.28 | 1.78 |
| 2019-10-31 | 2 | 2.18 | 2.28 | 1.75 |
| 2019-11-01 | 2 | 2.17 | 2.27 | 1.74 |
| 2019-11-04 | 2 | 2.18 | 2.28 | 1.79 |
| 2019-11-05 | 2 | 2.18 | 2.28 | 1.82 |
| 2019-11-06 | 2 | 2.18 | 2.28 | 1.83 |
| 2019-11-07 | 2 | 2.18 | 2.28 | 1.85 |
| 2019-11-08 | 2 | 2.19 | 2.29 | 1.97 |
| 2019-11-11 | 2 | 2.18 | 2.29 | 1.99 |
| 2019-11-12 | 2 | 2.18 | 2.29 | 1.97 |
| 2019-11-13 | 2 | 2.18 | 2.29 | 1.92 |
| 2019-11-14 | 2 | 2.17 | 2.28 | 1.85 |
| 2019-11-15 | 2 | 2.17 | 2.28 | 1.83 |
| 2019-11-18 | 2 | 2.18 | 2.29 | 1.85 |
| 2019-11-19 | 2 | 2.18 | 2.29 | 1.87 |
| 2019-11-20 | 2 | 2.18 | 2.28 | 1.85 |
| 2019-11-21 | 2 | 2.18 | 2.28 | 1.86 |
| 2019-11-22 | 2 | 2.18 | 2.28 | 1.87 |
| 2019-11-25 | 2 | 2.18 | 2.28 | 1.87 |
| 2019-11-26 | 2 | 2.18 | 2.28 | 1.84 |
| 2019-11-27 | 2 | 2.18 | 2.28 | 1.81 |
| 2019-11-28 | 2 | 2.18 | 2.28 | 1.81 |
| 2019-11-29 | 2 | 2.18 | 2.28 | 1.83 |
| 2019-12-02 | 2 | 2.18 | 2.28 | 1.89 |
| 2019-12-03 | 2 | 2.18 | 2.27 | 1.88 |
| 2019-12-04 | 2 | 2.18 | 2.26 | 1.87 |
| 2019-12-05 | 2 | 2.18 | 2.26 | 1.9 |
| 2019-12-06 | 2 | 2.18 | 2.26 | 1.91 |
| 2019-12-09 | 2 | 2.18 | 2.26 | 1.91 |
| 2019-12-10 | 2 | 2.18 | 2.26 | 1.93 |
| 2019-12-11 | 2 | 2.18 | 2.26 | 1.89 |
| 2019-12-12 | 2 | 2.18 | 2.26 | 1.88 |
| 2019-12-13 | 2 | 2.18 | 2.27 | 1.96 |
| 2019-12-16 | 2 | 2.18 | 2.27 | 1.93 |
| 2019-12-17 | 2 | 2.18 | 2.27 | 1.95 |
| 2019-12-18 | 2 | 2.18 | 2.27 | 1.95 |
| 2019-12-19 | 2 | 2.18 | 2.27 | 2.05 |
| 2019-12-20 | 2 | 2.18 | 2.27 | 2.03 |
| 2019-12-23 | 2 | 2.18 | 2.27 | 2.01 |
| 2019-12-27 | 2 | 2.18 | 2.27 | 2.02 |
| 2019-12-30 | 2 | 2.18 | 2.27 | 2.05 |
| 2019-12-31 | 2 | 2.18 | 2.27 | 2.07 |
| 2020-01-02 | 2 | 2.18 | 2.27 | 2.11 |
| 2020-01-03 | 2 | 2.17 | 2.27 | 2.03 |
| 2020-01-06 | 2 | 2.17 | 2.27 | 2.02 |
| 2020-01-07 | 2 | 2.17 | 2.27 | 2.04 |
| 2020-01-08 | 2 | 2.17 | 2.27 | 2.05 |
| 2020-01-09 | 2 | 2.17 | 2.27 | 2.07 |
| 2020-01-10 | 2 | 2.17 | 2.27 | 2.06 |
| 2020-01-13 | 2 | 2.17 | 2.27 | 2.13 |
| 2020-01-14 | 2 | 2.17 | 2.28 | 2.15 |
| 2020-01-15 | 2 | 2.17 | 2.28 | 2.08 |
| 2020-01-16 | 2 | 2.17 | 2.28 | 2.11 |
| 2020-01-17 | 2 | 2.17 | 2.28 | 2.05 |
| 2020-01-20 | 2 | 2.17 | 2.28 | 2.09 |
| 2020-01-21 | 2 | 2.17 | 2.28 | 2.08 |
| 2020-01-22 | 2 | 2.17 | 2.28 | 2.04 |
| 2020-01-23 | 2 | 2.17 | 2.28 | 1.9 |
| 2020-01-24 | 2 | 2.17 | 2.28 | 1.88 |
| 2020-01-27 | 2 | 2.17 | 2.27 | 1.84 |
| 2020-01-28 | 2 | 2.17 | 2.27 | 1.82 |
| 2020-01-29 | 2 | 2.17 | 2.27 | 1.9 |
| 2020-01-30 | 2 | 2.16 | 2.27 | 1.81 |
| 2020-01-31 | 2 | 2.16 | 2.27 | 1.82 |
| 2020-02-03 | 2 | 2.16 | 2.27 | 1.8 |
| 2020-02-04 | 2 | 2.16 | 2.27 | 1.86 |
| 2020-02-05 | 2 | 2.16 | 2.27 | 1.9 |
| 2020-02-06 | 2 | 2.16 | 2.27 | 1.89 |
| 2020-02-07 | 2.25 | 2.39 | 2.48 | 1.91 |
| 2020-02-10 | 2.25 | 2.39 | 2.47 | 1.91 |
| 2020-02-11 | 2.25 | 2.39 | 2.46 | 1.95 |
| 2020-02-12 | 2.25 | 2.39 | 2.45 | 2 |
| 2020-02-13 | 2.25 | 2.39 | 2.45 | 1.96 |
| 2020-02-14 | 2.25 | 2.39 | 2.45 | 1.99 |
| 2020-02-17 | 2.25 | 2.39 | 2.45 | 2 |
| 2020-02-18 | 2.25 | 2.39 | 2.45 | 1.98 |
| 2020-02-19 | 2.25 | 2.39 | 2.45 | 1.94 |
| 2020-02-20 | 2.25 | 2.39 | 2.45 | 1.91 |
| 2020-02-21 | 2.25 | 2.39 | 2.45 | 1.89 |
| 2020-02-24 | 2.25 | 2.39 | 2.45 | 1.84 |
| 2020-02-25 | 2.25 | 2.39 | 2.45 | 1.78 |
| 2020-02-26 | 2.25 | 2.39 | 2.45 | 1.74 |
| 2020-02-27 | 2.25 | 2.39 | 2.45 | 1.75 |
| 2020-02-28 | 2.25 | 2.38 | 2.43 | 1.55 |
| 2020-03-02 | 2.25 | 2.37 | 2.41 | 1.47 |
| 2020-03-03 | 2.25 | 2.35 | 2.38 | 1.52 |
| 2020-03-04 | 2.25 | 2.34 | 2.37 | 1.37 |
| 2020-03-05 | 2.25 | 2.34 | 2.37 | 1.45 |
| 2020-03-06 | 2.25 | 2.34 | 2.37 | 1.28 |
| 2020-03-09 | 2.25 | 2.34 | 2.36 | 1.02 |
| 2020-03-10 | 2.25 | 2.34 | 2.36 | 1.14 |
| 2020-03-11 | 2.25 | 2.33 | 2.36 | 1.08 |
| 2020-03-12 | 2.25 | 2.32 | 2.34 | 1.17 |
| 2020-03-13 | 2.25 | 2.31 | 2.34 | 1.34 |
| 2020-03-16 | 2.25 | 2.31 | 2.33 | 1.24 |
| 2020-03-17 | 1.75 | 1.83 | 1.85 | 1.07 |
| 2020-03-18 | 1.75 | 1.8 | 1.8 | 1.01 |
| 2020-03-19 | 1.75 | 1.79 | 1.77 | 0.87 |
| 2020-03-20 | 1.75 | 1.78 | 1.77 | 0.83 |
| 2020-03-23 | 1.75 | 1.76 | 1.75 | 0.73 |
| 2020-03-24 | 1.75 | 1.74 | 1.72 | 0.66 |
| 2020-03-25 | 1.75 | 1.72 | 1.71 | 0.79 |
| 2020-03-26 | 1.75 | 1.71 | 1.68 | 0.79 |
| 2020-03-27 | 1 | 1.08 | 1.11 | 0.71 |
| 2020-03-30 | 1 | 1.04 | 1.04 | 0.68 |
| 2020-03-31 | 1 | 1.03 | 1 | 0.75 |
| 2020-04-01 | 1 | 1.02 | 0.98 | 0.74 |
| 2020-04-02 | 1 | 1.02 | 0.98 | 0.81 |
| 2020-04-03 | 1 | 1.01 | 0.97 | 0.79 |
| 2020-04-06 | 1 | 1.01 | 0.97 | 0.78 |
| 2020-04-07 | 1 | 1.01 | 0.97 | 0.78 |
| 2020-04-08 | 1 | 1 | 0.97 | 0.79 |
| 2020-04-09 | 1 | 1 | 0.97 | 0.83 |
| 2020-04-14 | 1 | 0.98 | 0.94 | 0.81 |
| 2020-04-15 | 1 | 0.98 | 0.93 | 0.76 |
| 2020-04-16 | 1 | 0.97 | 0.92 | 0.75 |
| 2020-04-17 | 1 | 0.97 | 0.91 | 0.73 |
| 2020-04-20 | 1 | 0.97 | 0.91 | 0.7 |
| 2020-04-21 | 1 | 0.96 | 0.89 | 0.7 |
| 2020-04-22 | 1 | 0.95 | 0.88 | 0.71 |
| 2020-04-23 | 1 | 0.93 | 0.88 | 0.73 |
| 2020-04-24 | 1 | 0.91 | 0.87 | 0.72 |
| 2020-04-27 | 1 | 0.9 | 0.87 | 0.72 |
| 2020-04-28 | 1 | 0.9 | 0.87 | 0.75 |
| 2020-04-29 | 1 | 0.9 | 0.86 | 0.73 |
| 2020-04-30 | 1 | 0.9 | 0.86 | 0.69 |